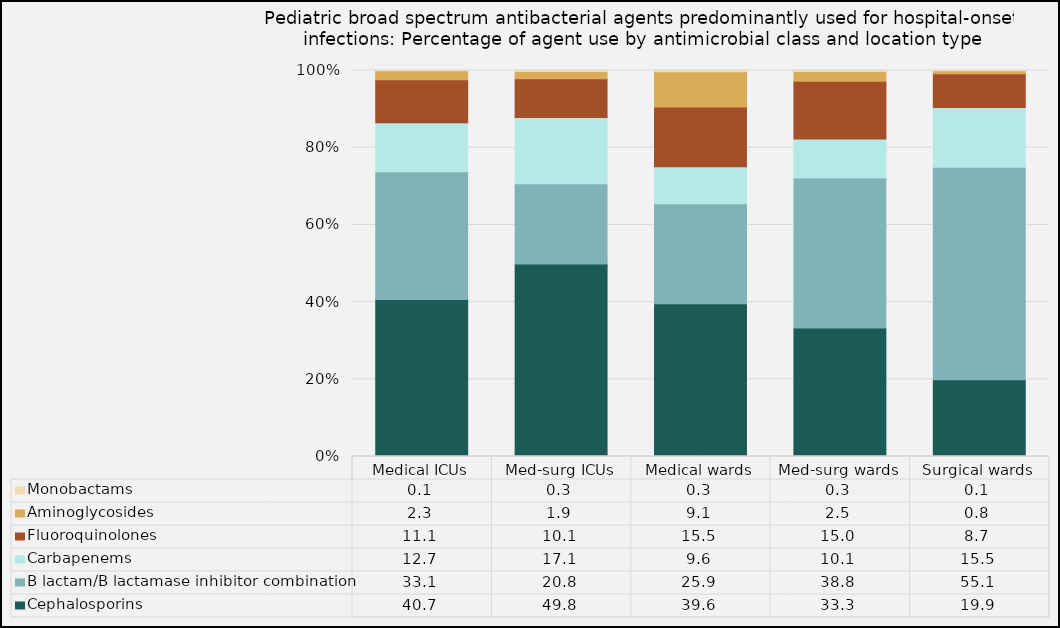
| Category | Cephalosporins | B lactam/B lactamase inhibitor combination | Carbapenems | Fluoroquinolones | Aminoglycosides | Monobactams |
|---|---|---|---|---|---|---|
| Medical ICUs | 40.65 | 33.11 | 12.72 | 11.13 | 2.31 | 0.08 |
| Med-surg ICUs | 49.84 | 20.82 | 17.14 | 10.08 | 1.86 | 0.26 |
| Medical wards | 39.56 | 25.89 | 9.61 | 15.48 | 9.14 | 0.32 |
| Med-surg wards | 33.29 | 38.83 | 10.14 | 14.96 | 2.49 | 0.29 |
| Surgical wards | 19.87 | 55.07 | 15.51 | 8.71 | 0.77 | 0.08 |